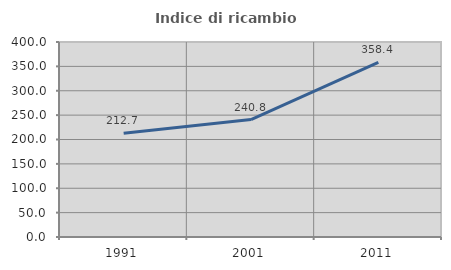
| Category | Indice di ricambio occupazionale  |
|---|---|
| 1991.0 | 212.741 |
| 2001.0 | 240.84 |
| 2011.0 | 358.405 |